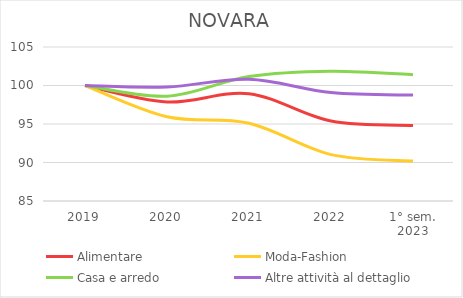
| Category | Alimentare | Moda-Fashion | Casa e arredo | Altre attività al dettaglio |
|---|---|---|---|---|
| 2019 | 100 | 100 | 100 | 100 |
| 2020 | 97.855 | 95.936 | 98.605 | 99.808 |
| 2021 | 98.927 | 95.092 | 101.163 | 100.817 |
| 2022 | 95.38 | 91.028 | 101.86 | 99.087 |
| 1° sem.
2023 | 94.802 | 90.184 | 101.395 | 98.751 |